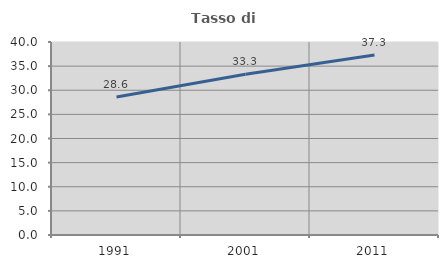
| Category | Tasso di occupazione   |
|---|---|
| 1991.0 | 28.589 |
| 2001.0 | 33.333 |
| 2011.0 | 37.302 |